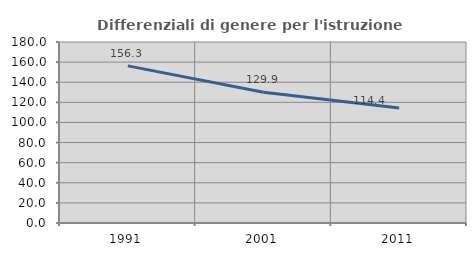
| Category | Differenziali di genere per l'istruzione superiore |
|---|---|
| 1991.0 | 156.276 |
| 2001.0 | 129.948 |
| 2011.0 | 114.371 |